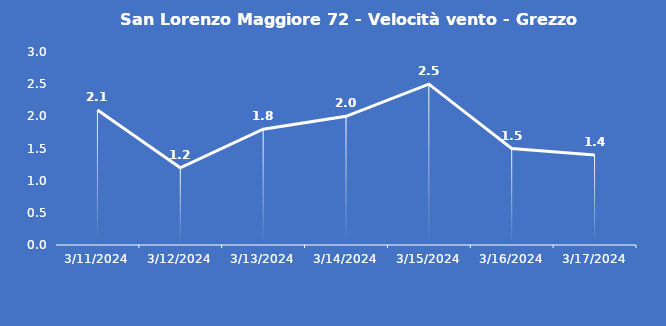
| Category | San Lorenzo Maggiore 72 - Velocità vento - Grezzo (m/s) |
|---|---|
| 3/11/24 | 2.1 |
| 3/12/24 | 1.2 |
| 3/13/24 | 1.8 |
| 3/14/24 | 2 |
| 3/15/24 | 2.5 |
| 3/16/24 | 1.5 |
| 3/17/24 | 1.4 |